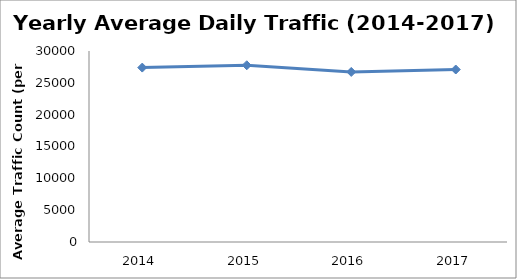
| Category | Series 0 |
|---|---|
| 2014.0 | 27395.31 |
| 2015.0 | 27760.619 |
| 2016.0 | 26713.598 |
| 2017.0 | 27092.121 |